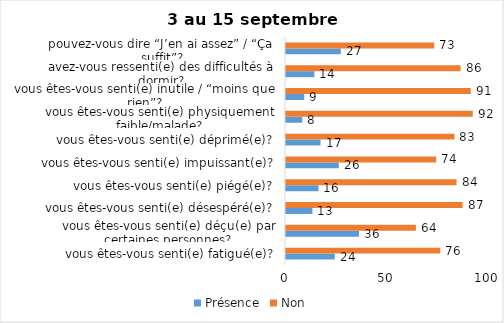
| Category | Présence | Non |
|---|---|---|
| vous êtes-vous senti(e) fatigué(e)? | 24 | 76 |
| vous êtes-vous senti(e) déçu(e) par certaines personnes? | 36 | 64 |
| vous êtes-vous senti(e) désespéré(e)? | 13 | 87 |
| vous êtes-vous senti(e) piégé(e)? | 16 | 84 |
| vous êtes-vous senti(e) impuissant(e)? | 26 | 74 |
| vous êtes-vous senti(e) déprimé(e)? | 17 | 83 |
| vous êtes-vous senti(e) physiquement faible/malade? | 8 | 92 |
| vous êtes-vous senti(e) inutile / “moins que rien”? | 9 | 91 |
| avez-vous ressenti(e) des difficultés à dormir? | 14 | 86 |
| pouvez-vous dire “J’en ai assez” / “Ça suffit”? | 27 | 73 |